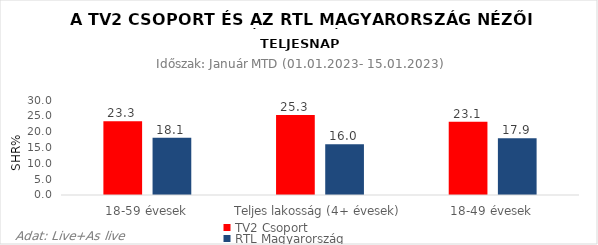
| Category | TV2 Csoport | RTL Magyarország |
|---|---|---|
| 18-59 évesek | 23.3 | 18.1 |
| Teljes lakosság (4+ évesek) | 25.3 | 16 |
| 18-49 évesek | 23.1 | 17.9 |